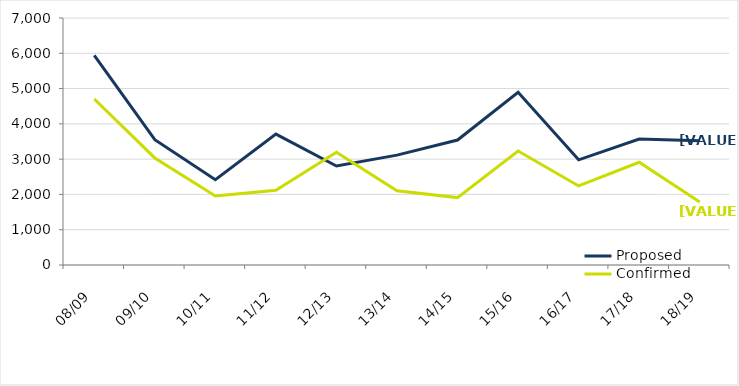
| Category | Proposed | Confirmed |
|---|---|---|
| 08/09 | 5941 | 4705 |
| 09/10 | 3550 | 3034 |
| 10/11 | 2419 | 1957 |
| 11/12 | 3711 | 2120 |
| 12/13 | 2806 | 3194 |
| 13/14 | 3113 | 2103 |
| 14/15 | 3542 | 1910 |
| 15/16 | 4893 | 3229 |
| 16/17 | 2981 | 2240 |
| 17/18 | 3570 | 2911 |
| 18/19 | 3518 | 1785 |